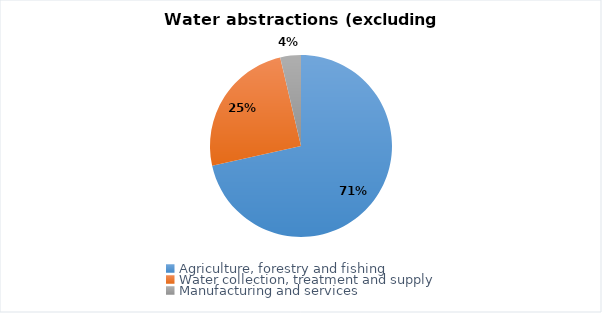
| Category | Series 0 |
|---|---|
| Agriculture, forestry and fishing | 1672.837 |
| Water collection, treatment and supply | 579.558 |
| Manufacturing and services | 85.926 |